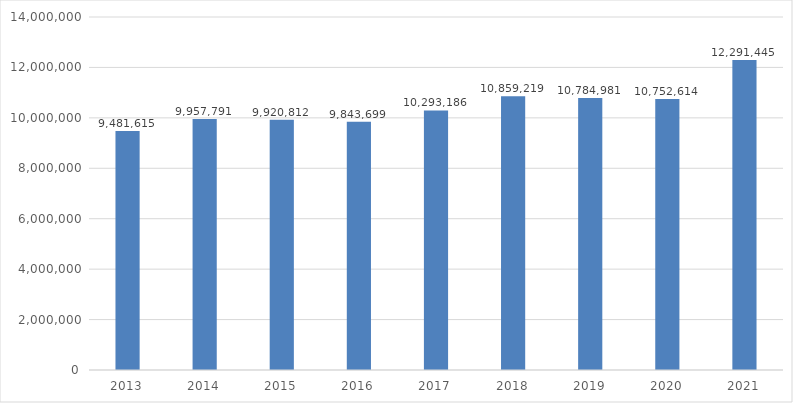
| Category | Series 0 | año |
|---|---|---|
| 2013.0 | 9481615.09 |  |
| 2014.0 | 9957790.75 |  |
| 2015.0 | 9920811.76 |  |
| 2016.0 | 9843699.24 |  |
| 2017.0 | 10293186.36 |  |
| 2018.0 | 10859218.62 |  |
| 2019.0 | 10784981.49 |  |
| 2020.0 | 10752614.22 |  |
| 2021.0 | 12291444.52 |  |